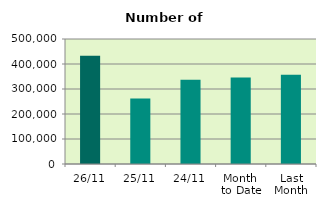
| Category | Series 0 |
|---|---|
| 26/11 | 432612 |
| 25/11 | 262192 |
| 24/11 | 337104 |
| Month 
to Date | 346396.1 |
| Last
Month | 357160.667 |